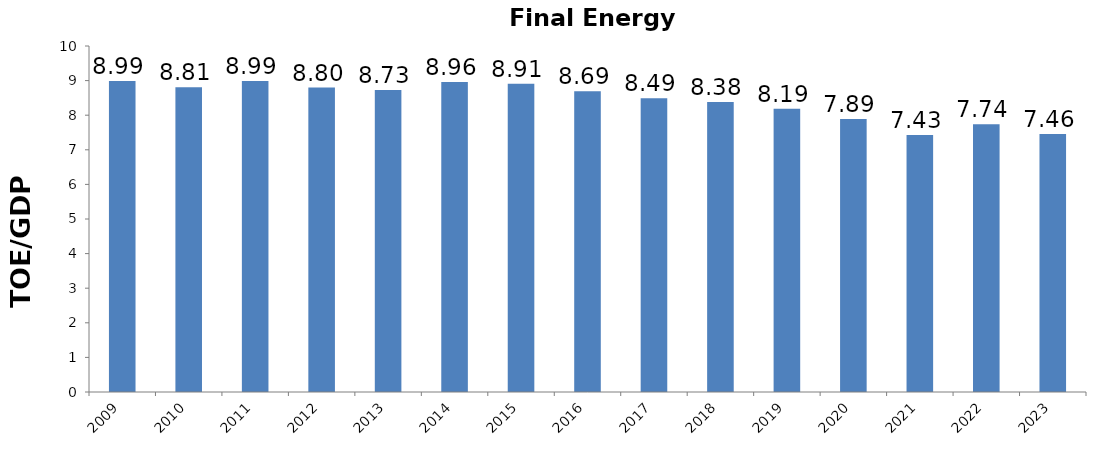
| Category | FEC : GDP (toe : M.Bahts) |
|---|---|
| 2009 | 8.99 |
| 2010 | 8.81 |
| 2011 | 8.99 |
| 2012 | 8.8 |
| 2013 | 8.73 |
| 2014 | 8.96 |
| 2015 | 8.91 |
| 2016 | 8.69 |
| 2017 | 8.49 |
| 2018 | 8.38 |
| 2019 | 8.19 |
| 2020 | 7.89 |
| 2021 | 7.43 |
| 2022 | 7.74 |
| 2023 | 7.46 |